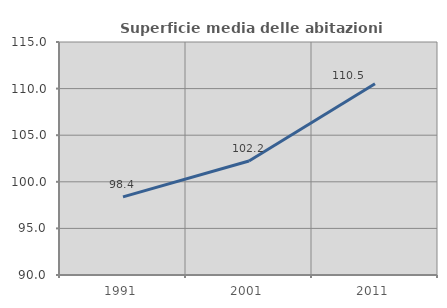
| Category | Superficie media delle abitazioni occupate |
|---|---|
| 1991.0 | 98.378 |
| 2001.0 | 102.234 |
| 2011.0 | 110.516 |